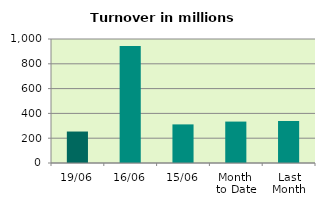
| Category | Series 0 |
|---|---|
| 19/06 | 253.825 |
| 16/06 | 943.754 |
| 15/06 | 311.366 |
| Month 
to Date | 334.057 |
| Last
Month | 338.969 |